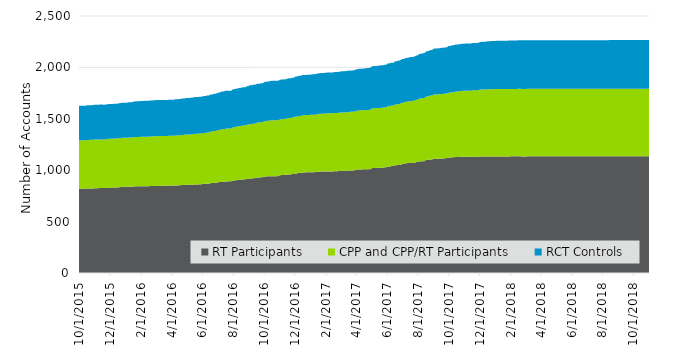
| Category | RT Participants | CPP and CPP/RT Participants | RCT Controls |
|---|---|---|---|
| 2015-10-01 | 819 | 470 | 337 |
| 2015-10-02 | 819 | 470 | 337 |
| 2015-10-03 | 820 | 470 | 337 |
| 2015-10-04 | 820 | 470 | 337 |
| 2015-10-05 | 819 | 470 | 337 |
| 2015-10-06 | 819 | 470 | 337 |
| 2015-10-07 | 820 | 470 | 337 |
| 2015-10-08 | 820 | 470 | 337 |
| 2015-10-09 | 821 | 470 | 337 |
| 2015-10-10 | 821 | 470 | 337 |
| 2015-10-11 | 821 | 470 | 337 |
| 2015-10-12 | 821 | 470 | 337 |
| 2015-10-13 | 821 | 470 | 337 |
| 2015-10-14 | 821 | 470 | 337 |
| 2015-10-15 | 822 | 470 | 337 |
| 2015-10-16 | 822 | 472 | 337 |
| 2015-10-17 | 822 | 472 | 337 |
| 2015-10-18 | 822 | 472 | 337 |
| 2015-10-19 | 822 | 472 | 337 |
| 2015-10-20 | 822 | 472 | 337 |
| 2015-10-21 | 823 | 472 | 337 |
| 2015-10-22 | 823 | 472 | 337 |
| 2015-10-23 | 823 | 472 | 337 |
| 2015-10-24 | 823 | 473 | 337 |
| 2015-10-25 | 823 | 473 | 337 |
| 2015-10-26 | 823 | 473 | 337 |
| 2015-10-27 | 823 | 473 | 338 |
| 2015-10-28 | 823 | 473 | 338 |
| 2015-10-29 | 823 | 473 | 338 |
| 2015-10-30 | 823 | 473 | 338 |
| 2015-10-31 | 825 | 473 | 338 |
| 2015-11-01 | 825 | 473 | 338 |
| 2015-11-02 | 825 | 473 | 338 |
| 2015-11-03 | 825 | 473 | 339 |
| 2015-11-04 | 825 | 473 | 339 |
| 2015-11-05 | 825 | 473 | 339 |
| 2015-11-06 | 825 | 473 | 339 |
| 2015-11-07 | 825 | 473 | 339 |
| 2015-11-08 | 825 | 473 | 339 |
| 2015-11-09 | 825 | 473 | 339 |
| 2015-11-10 | 826 | 473 | 339 |
| 2015-11-11 | 826 | 473 | 339 |
| 2015-11-12 | 826 | 473 | 339 |
| 2015-11-13 | 826 | 473 | 339 |
| 2015-11-14 | 826 | 473 | 339 |
| 2015-11-15 | 826 | 473 | 339 |
| 2015-11-16 | 826 | 473 | 339 |
| 2015-11-17 | 826 | 473 | 339 |
| 2015-11-18 | 826 | 473 | 338 |
| 2015-11-19 | 826 | 473 | 338 |
| 2015-11-20 | 826 | 473 | 338 |
| 2015-11-21 | 826 | 474 | 338 |
| 2015-11-22 | 826 | 474 | 338 |
| 2015-11-23 | 826 | 474 | 338 |
| 2015-11-24 | 826 | 474 | 338 |
| 2015-11-25 | 827 | 474 | 338 |
| 2015-11-26 | 829 | 474 | 338 |
| 2015-11-27 | 830 | 474 | 338 |
| 2015-11-28 | 830 | 475 | 338 |
| 2015-11-29 | 830 | 475 | 338 |
| 2015-11-30 | 830 | 475 | 338 |
| 2015-12-01 | 831 | 476 | 338 |
| 2015-12-02 | 831 | 476 | 338 |
| 2015-12-03 | 831 | 476 | 338 |
| 2015-12-04 | 831 | 476 | 338 |
| 2015-12-05 | 831 | 476 | 338 |
| 2015-12-06 | 831 | 476 | 338 |
| 2015-12-07 | 831 | 476 | 338 |
| 2015-12-08 | 832 | 476 | 339 |
| 2015-12-09 | 832 | 476 | 339 |
| 2015-12-10 | 832 | 476 | 339 |
| 2015-12-11 | 832 | 476 | 339 |
| 2015-12-12 | 832 | 476 | 339 |
| 2015-12-13 | 832 | 476 | 339 |
| 2015-12-14 | 832 | 476 | 339 |
| 2015-12-15 | 832 | 476 | 339 |
| 2015-12-16 | 833 | 476 | 339 |
| 2015-12-17 | 834 | 476 | 339 |
| 2015-12-18 | 835 | 476 | 339 |
| 2015-12-19 | 835 | 477 | 339 |
| 2015-12-20 | 835 | 477 | 339 |
| 2015-12-21 | 835 | 477 | 339 |
| 2015-12-22 | 836 | 477 | 340 |
| 2015-12-23 | 836 | 477 | 340 |
| 2015-12-24 | 837 | 477 | 341 |
| 2015-12-25 | 838 | 477 | 341 |
| 2015-12-26 | 838 | 477 | 341 |
| 2015-12-27 | 838 | 477 | 341 |
| 2015-12-28 | 838 | 477 | 341 |
| 2015-12-29 | 838 | 477 | 341 |
| 2015-12-30 | 838 | 477 | 341 |
| 2015-12-31 | 838 | 477 | 341 |
| 2016-01-01 | 838 | 477 | 341 |
| 2016-01-02 | 838 | 477 | 341 |
| 2016-01-03 | 838 | 477 | 341 |
| 2016-01-04 | 838 | 477 | 341 |
| 2016-01-05 | 839 | 477 | 343 |
| 2016-01-06 | 839 | 477 | 344 |
| 2016-01-07 | 839 | 477 | 344 |
| 2016-01-08 | 839 | 478 | 344 |
| 2016-01-09 | 839 | 479 | 344 |
| 2016-01-10 | 839 | 479 | 344 |
| 2016-01-11 | 839 | 479 | 344 |
| 2016-01-12 | 839 | 479 | 344 |
| 2016-01-13 | 839 | 479 | 344 |
| 2016-01-14 | 840 | 479 | 344 |
| 2016-01-15 | 840 | 480 | 344 |
| 2016-01-16 | 841 | 481 | 345 |
| 2016-01-17 | 841 | 481 | 345 |
| 2016-01-18 | 841 | 481 | 345 |
| 2016-01-19 | 842 | 481 | 346 |
| 2016-01-20 | 843 | 481 | 346 |
| 2016-01-21 | 843 | 481 | 347 |
| 2016-01-22 | 843 | 481 | 347 |
| 2016-01-23 | 843 | 481 | 347 |
| 2016-01-24 | 843 | 481 | 347 |
| 2016-01-25 | 843 | 481 | 347 |
| 2016-01-26 | 843 | 481 | 347 |
| 2016-01-27 | 843 | 481 | 347 |
| 2016-01-28 | 843 | 481 | 347 |
| 2016-01-29 | 843 | 481 | 347 |
| 2016-01-30 | 843 | 482 | 349 |
| 2016-01-31 | 843 | 482 | 349 |
| 2016-02-01 | 843 | 482 | 349 |
| 2016-02-02 | 843 | 482 | 349 |
| 2016-02-03 | 843 | 482 | 349 |
| 2016-02-04 | 843 | 482 | 349 |
| 2016-02-05 | 843 | 482 | 349 |
| 2016-02-06 | 844 | 482 | 349 |
| 2016-02-07 | 844 | 482 | 349 |
| 2016-02-08 | 844 | 482 | 349 |
| 2016-02-09 | 844 | 482 | 349 |
| 2016-02-10 | 844 | 482 | 349 |
| 2016-02-11 | 844 | 482 | 349 |
| 2016-02-12 | 844 | 482 | 350 |
| 2016-02-13 | 844 | 482 | 350 |
| 2016-02-14 | 844 | 482 | 350 |
| 2016-02-15 | 844 | 482 | 350 |
| 2016-02-16 | 844 | 482 | 350 |
| 2016-02-17 | 845 | 482 | 350 |
| 2016-02-18 | 846 | 482 | 350 |
| 2016-02-19 | 846 | 482 | 350 |
| 2016-02-20 | 846 | 482 | 350 |
| 2016-02-21 | 846 | 482 | 350 |
| 2016-02-22 | 846 | 482 | 350 |
| 2016-02-23 | 847 | 482 | 350 |
| 2016-02-24 | 847 | 483 | 350 |
| 2016-02-25 | 847 | 483 | 350 |
| 2016-02-26 | 847 | 483 | 351 |
| 2016-02-27 | 847 | 483 | 351 |
| 2016-02-28 | 847 | 483 | 351 |
| 2016-02-29 | 847 | 483 | 351 |
| 2016-03-01 | 847 | 484 | 351 |
| 2016-03-02 | 847 | 484 | 351 |
| 2016-03-03 | 847 | 484 | 351 |
| 2016-03-04 | 847 | 484 | 351 |
| 2016-03-05 | 848 | 484 | 351 |
| 2016-03-06 | 848 | 484 | 351 |
| 2016-03-07 | 848 | 484 | 351 |
| 2016-03-08 | 848 | 484 | 351 |
| 2016-03-09 | 848 | 484 | 351 |
| 2016-03-10 | 848 | 484 | 351 |
| 2016-03-11 | 848 | 484 | 351 |
| 2016-03-12 | 848 | 484 | 351 |
| 2016-03-13 | 848 | 484 | 351 |
| 2016-03-14 | 848 | 484 | 351 |
| 2016-03-15 | 848 | 484 | 351 |
| 2016-03-16 | 848 | 484 | 351 |
| 2016-03-17 | 848 | 484 | 351 |
| 2016-03-18 | 848 | 484 | 351 |
| 2016-03-19 | 848 | 484 | 351 |
| 2016-03-20 | 848 | 484 | 351 |
| 2016-03-21 | 848 | 484 | 351 |
| 2016-03-22 | 848 | 484 | 351 |
| 2016-03-23 | 848 | 484 | 351 |
| 2016-03-24 | 848 | 484 | 351 |
| 2016-03-25 | 850 | 484 | 351 |
| 2016-03-26 | 850 | 484 | 351 |
| 2016-03-27 | 850 | 484 | 351 |
| 2016-03-28 | 850 | 484 | 351 |
| 2016-03-29 | 850 | 484 | 351 |
| 2016-03-30 | 850 | 484 | 351 |
| 2016-03-31 | 850 | 484 | 351 |
| 2016-04-01 | 851 | 484 | 351 |
| 2016-04-02 | 851 | 484 | 351 |
| 2016-04-03 | 851 | 484 | 351 |
| 2016-04-04 | 851 | 484 | 351 |
| 2016-04-05 | 851 | 484 | 351 |
| 2016-04-06 | 852 | 484 | 351 |
| 2016-04-07 | 852 | 484 | 351 |
| 2016-04-08 | 852 | 485 | 352 |
| 2016-04-09 | 852 | 485 | 352 |
| 2016-04-10 | 852 | 485 | 352 |
| 2016-04-11 | 852 | 485 | 352 |
| 2016-04-12 | 852 | 485 | 352 |
| 2016-04-13 | 852 | 485 | 352 |
| 2016-04-14 | 853 | 486 | 352 |
| 2016-04-15 | 853 | 486 | 352 |
| 2016-04-16 | 854 | 487 | 352 |
| 2016-04-17 | 854 | 487 | 352 |
| 2016-04-18 | 854 | 487 | 352 |
| 2016-04-19 | 854 | 487 | 353 |
| 2016-04-20 | 854 | 487 | 353 |
| 2016-04-21 | 856 | 487 | 353 |
| 2016-04-22 | 856 | 487 | 354 |
| 2016-04-23 | 856 | 487 | 354 |
| 2016-04-24 | 856 | 487 | 354 |
| 2016-04-25 | 856 | 487 | 354 |
| 2016-04-26 | 857 | 487 | 354 |
| 2016-04-27 | 857 | 487 | 354 |
| 2016-04-28 | 858 | 487 | 354 |
| 2016-04-29 | 858 | 488 | 354 |
| 2016-04-30 | 858 | 489 | 355 |
| 2016-05-01 | 858 | 489 | 355 |
| 2016-05-02 | 858 | 489 | 355 |
| 2016-05-03 | 858 | 489 | 355 |
| 2016-05-04 | 858 | 489 | 355 |
| 2016-05-05 | 858 | 489 | 355 |
| 2016-05-06 | 859 | 489 | 355 |
| 2016-05-07 | 859 | 489 | 356 |
| 2016-05-08 | 859 | 489 | 356 |
| 2016-05-09 | 859 | 489 | 356 |
| 2016-05-10 | 859 | 490 | 356 |
| 2016-05-11 | 859 | 490 | 356 |
| 2016-05-12 | 859 | 490 | 356 |
| 2016-05-13 | 860 | 491 | 356 |
| 2016-05-14 | 862 | 491 | 356 |
| 2016-05-15 | 862 | 491 | 356 |
| 2016-05-16 | 862 | 491 | 356 |
| 2016-05-17 | 862 | 493 | 357 |
| 2016-05-18 | 862 | 493 | 357 |
| 2016-05-19 | 862 | 493 | 357 |
| 2016-05-20 | 862 | 493 | 358 |
| 2016-05-21 | 862 | 493 | 358 |
| 2016-05-22 | 862 | 493 | 358 |
| 2016-05-23 | 862 | 493 | 358 |
| 2016-05-24 | 862 | 493 | 358 |
| 2016-05-25 | 862 | 493 | 358 |
| 2016-05-26 | 863 | 493 | 358 |
| 2016-05-27 | 863 | 493 | 358 |
| 2016-05-28 | 864 | 493 | 358 |
| 2016-05-29 | 864 | 493 | 358 |
| 2016-05-30 | 864 | 493 | 358 |
| 2016-05-31 | 864 | 493 | 358 |
| 2016-06-01 | 866 | 493 | 358 |
| 2016-06-02 | 866 | 495 | 359 |
| 2016-06-03 | 866 | 495 | 359 |
| 2016-06-04 | 867 | 495 | 359 |
| 2016-06-05 | 867 | 495 | 359 |
| 2016-06-06 | 867 | 495 | 359 |
| 2016-06-07 | 867 | 496 | 359 |
| 2016-06-08 | 867 | 497 | 359 |
| 2016-06-09 | 868 | 497 | 360 |
| 2016-06-10 | 868 | 498 | 360 |
| 2016-06-11 | 868 | 499 | 360 |
| 2016-06-12 | 868 | 499 | 360 |
| 2016-06-13 | 868 | 499 | 360 |
| 2016-06-14 | 869 | 499 | 360 |
| 2016-06-15 | 870 | 500 | 360 |
| 2016-06-16 | 873 | 501 | 360 |
| 2016-06-17 | 874 | 501 | 360 |
| 2016-06-18 | 875 | 501 | 360 |
| 2016-06-19 | 875 | 501 | 360 |
| 2016-06-20 | 875 | 501 | 360 |
| 2016-06-21 | 876 | 502 | 360 |
| 2016-06-22 | 877 | 503 | 360 |
| 2016-06-23 | 877 | 504 | 360 |
| 2016-06-24 | 877 | 504 | 362 |
| 2016-06-25 | 878 | 504 | 362 |
| 2016-06-26 | 878 | 504 | 362 |
| 2016-06-27 | 878 | 504 | 362 |
| 2016-06-28 | 879 | 504 | 362 |
| 2016-06-29 | 879 | 504 | 363 |
| 2016-06-30 | 881 | 505 | 363 |
| 2016-07-01 | 883 | 507 | 364 |
| 2016-07-02 | 883 | 507 | 364 |
| 2016-07-03 | 883 | 507 | 364 |
| 2016-07-04 | 883 | 507 | 364 |
| 2016-07-05 | 885 | 509 | 364 |
| 2016-07-06 | 885 | 510 | 364 |
| 2016-07-07 | 885 | 510 | 364 |
| 2016-07-08 | 886 | 511 | 366 |
| 2016-07-09 | 887 | 511 | 368 |
| 2016-07-10 | 887 | 511 | 368 |
| 2016-07-11 | 887 | 511 | 368 |
| 2016-07-12 | 887 | 511 | 368 |
| 2016-07-13 | 887 | 511 | 368 |
| 2016-07-14 | 887 | 512 | 368 |
| 2016-07-15 | 888 | 512 | 368 |
| 2016-07-16 | 890 | 514 | 368 |
| 2016-07-17 | 890 | 514 | 368 |
| 2016-07-18 | 890 | 514 | 368 |
| 2016-07-19 | 891 | 514 | 368 |
| 2016-07-20 | 891 | 514 | 368 |
| 2016-07-21 | 891 | 514 | 368 |
| 2016-07-22 | 891 | 514 | 368 |
| 2016-07-23 | 892 | 513 | 368 |
| 2016-07-24 | 892 | 513 | 368 |
| 2016-07-25 | 892 | 513 | 368 |
| 2016-07-26 | 892 | 513 | 368 |
| 2016-07-27 | 892 | 513 | 368 |
| 2016-07-28 | 893 | 513 | 368 |
| 2016-07-29 | 893 | 516 | 368 |
| 2016-07-30 | 897 | 518 | 369 |
| 2016-07-31 | 897 | 518 | 369 |
| 2016-08-01 | 898 | 519 | 369 |
| 2016-08-02 | 898 | 519 | 369 |
| 2016-08-03 | 901 | 519 | 369 |
| 2016-08-04 | 901 | 519 | 369 |
| 2016-08-05 | 903 | 519 | 370 |
| 2016-08-06 | 903 | 519 | 370 |
| 2016-08-07 | 903 | 519 | 370 |
| 2016-08-08 | 903 | 519 | 370 |
| 2016-08-09 | 905 | 519 | 370 |
| 2016-08-10 | 906 | 520 | 370 |
| 2016-08-11 | 906 | 522 | 370 |
| 2016-08-12 | 907 | 522 | 370 |
| 2016-08-13 | 907 | 522 | 370 |
| 2016-08-14 | 907 | 522 | 370 |
| 2016-08-15 | 907 | 522 | 370 |
| 2016-08-16 | 908 | 523 | 372 |
| 2016-08-17 | 908 | 523 | 372 |
| 2016-08-18 | 910 | 523 | 372 |
| 2016-08-19 | 910 | 524 | 372 |
| 2016-08-20 | 910 | 524 | 372 |
| 2016-08-21 | 910 | 524 | 372 |
| 2016-08-22 | 910 | 524 | 372 |
| 2016-08-23 | 912 | 524 | 372 |
| 2016-08-24 | 912 | 524 | 372 |
| 2016-08-25 | 912 | 524 | 372 |
| 2016-08-26 | 913 | 525 | 373 |
| 2016-08-27 | 916 | 526 | 374 |
| 2016-08-28 | 916 | 526 | 374 |
| 2016-08-29 | 916 | 526 | 374 |
| 2016-08-30 | 916 | 526 | 374 |
| 2016-08-31 | 918 | 526 | 374 |
| 2016-09-01 | 918 | 529 | 375 |
| 2016-09-02 | 919 | 530 | 377 |
| 2016-09-03 | 920 | 530 | 377 |
| 2016-09-04 | 920 | 530 | 377 |
| 2016-09-05 | 920 | 530 | 377 |
| 2016-09-06 | 920 | 530 | 377 |
| 2016-09-07 | 920 | 530 | 378 |
| 2016-09-08 | 922 | 530 | 378 |
| 2016-09-09 | 922 | 530 | 379 |
| 2016-09-10 | 922 | 531 | 379 |
| 2016-09-11 | 922 | 531 | 379 |
| 2016-09-12 | 922 | 531 | 379 |
| 2016-09-13 | 923 | 532 | 379 |
| 2016-09-14 | 923 | 532 | 379 |
| 2016-09-15 | 924 | 532 | 379 |
| 2016-09-16 | 925 | 533 | 379 |
| 2016-09-17 | 929 | 534 | 379 |
| 2016-09-18 | 929 | 534 | 379 |
| 2016-09-19 | 929 | 534 | 379 |
| 2016-09-20 | 929 | 534 | 379 |
| 2016-09-21 | 929 | 534 | 379 |
| 2016-09-22 | 929 | 534 | 379 |
| 2016-09-23 | 929 | 534 | 379 |
| 2016-09-24 | 932 | 534 | 379 |
| 2016-09-25 | 932 | 534 | 379 |
| 2016-09-26 | 932 | 534 | 379 |
| 2016-09-27 | 932 | 534 | 379 |
| 2016-09-28 | 933 | 535 | 379 |
| 2016-09-29 | 933 | 535 | 379 |
| 2016-09-30 | 938 | 535 | 381 |
| 2016-10-01 | 939 | 538 | 381 |
| 2016-10-02 | 939 | 538 | 381 |
| 2016-10-03 | 939 | 538 | 381 |
| 2016-10-04 | 939 | 539 | 381 |
| 2016-10-05 | 939 | 540 | 381 |
| 2016-10-06 | 939 | 540 | 382 |
| 2016-10-07 | 940 | 540 | 383 |
| 2016-10-08 | 941 | 540 | 383 |
| 2016-10-09 | 941 | 540 | 383 |
| 2016-10-10 | 941 | 540 | 383 |
| 2016-10-11 | 941 | 540 | 383 |
| 2016-10-12 | 941 | 541 | 383 |
| 2016-10-13 | 941 | 542 | 384 |
| 2016-10-14 | 942 | 542 | 384 |
| 2016-10-15 | 942 | 543 | 384 |
| 2016-10-16 | 942 | 543 | 384 |
| 2016-10-17 | 942 | 543 | 384 |
| 2016-10-18 | 942 | 543 | 384 |
| 2016-10-19 | 942 | 543 | 384 |
| 2016-10-20 | 942 | 543 | 384 |
| 2016-10-21 | 942 | 543 | 384 |
| 2016-10-22 | 942 | 543 | 384 |
| 2016-10-23 | 942 | 543 | 384 |
| 2016-10-24 | 942 | 543 | 384 |
| 2016-10-25 | 942 | 543 | 384 |
| 2016-10-26 | 942 | 543 | 384 |
| 2016-10-27 | 942 | 543 | 384 |
| 2016-10-28 | 943 | 543 | 384 |
| 2016-10-29 | 945 | 544 | 384 |
| 2016-10-30 | 945 | 544 | 384 |
| 2016-10-31 | 945 | 544 | 384 |
| 2016-11-01 | 950 | 544 | 385 |
| 2016-11-02 | 952 | 544 | 385 |
| 2016-11-03 | 952 | 544 | 385 |
| 2016-11-04 | 953 | 544 | 385 |
| 2016-11-05 | 954 | 544 | 385 |
| 2016-11-06 | 954 | 544 | 385 |
| 2016-11-07 | 954 | 544 | 385 |
| 2016-11-08 | 954 | 544 | 385 |
| 2016-11-09 | 954 | 545 | 385 |
| 2016-11-10 | 954 | 545 | 385 |
| 2016-11-11 | 955 | 545 | 385 |
| 2016-11-12 | 955 | 545 | 385 |
| 2016-11-13 | 955 | 545 | 385 |
| 2016-11-14 | 955 | 545 | 385 |
| 2016-11-15 | 956 | 547 | 386 |
| 2016-11-16 | 957 | 548 | 386 |
| 2016-11-17 | 958 | 548 | 386 |
| 2016-11-18 | 959 | 549 | 386 |
| 2016-11-19 | 959 | 549 | 386 |
| 2016-11-20 | 959 | 549 | 386 |
| 2016-11-21 | 959 | 549 | 386 |
| 2016-11-22 | 959 | 549 | 386 |
| 2016-11-23 | 960 | 549 | 386 |
| 2016-11-24 | 960 | 550 | 386 |
| 2016-11-25 | 962 | 550 | 386 |
| 2016-11-26 | 962 | 551 | 386 |
| 2016-11-27 | 962 | 551 | 386 |
| 2016-11-28 | 962 | 551 | 386 |
| 2016-11-29 | 964 | 552 | 386 |
| 2016-11-30 | 965 | 552 | 386 |
| 2016-12-01 | 967 | 554 | 388 |
| 2016-12-02 | 969 | 554 | 388 |
| 2016-12-03 | 969 | 554 | 389 |
| 2016-12-04 | 969 | 554 | 389 |
| 2016-12-05 | 969 | 554 | 389 |
| 2016-12-06 | 970 | 554 | 389 |
| 2016-12-07 | 972 | 554 | 390 |
| 2016-12-08 | 972 | 554 | 390 |
| 2016-12-09 | 974 | 554 | 390 |
| 2016-12-10 | 974 | 554 | 391 |
| 2016-12-11 | 974 | 554 | 391 |
| 2016-12-12 | 974 | 554 | 391 |
| 2016-12-13 | 975 | 555 | 391 |
| 2016-12-14 | 975 | 555 | 391 |
| 2016-12-15 | 976 | 556 | 391 |
| 2016-12-16 | 978 | 556 | 391 |
| 2016-12-17 | 978 | 556 | 391 |
| 2016-12-18 | 978 | 556 | 391 |
| 2016-12-19 | 978 | 556 | 391 |
| 2016-12-20 | 978 | 556 | 391 |
| 2016-12-21 | 979 | 556 | 391 |
| 2016-12-22 | 979 | 556 | 392 |
| 2016-12-23 | 981 | 556 | 392 |
| 2016-12-24 | 981 | 556 | 392 |
| 2016-12-25 | 981 | 556 | 392 |
| 2016-12-26 | 981 | 556 | 392 |
| 2016-12-27 | 981 | 556 | 392 |
| 2016-12-28 | 981 | 556 | 392 |
| 2016-12-29 | 981 | 556 | 392 |
| 2016-12-30 | 981 | 556 | 392 |
| 2016-12-31 | 981 | 558 | 392 |
| 2017-01-01 | 981 | 558 | 392 |
| 2017-01-02 | 981 | 558 | 392 |
| 2017-01-03 | 981 | 558 | 392 |
| 2017-01-04 | 981 | 558 | 394 |
| 2017-01-05 | 981 | 558 | 394 |
| 2017-01-06 | 981 | 558 | 394 |
| 2017-01-07 | 981 | 558 | 394 |
| 2017-01-08 | 981 | 558 | 394 |
| 2017-01-09 | 981 | 558 | 394 |
| 2017-01-10 | 982 | 558 | 394 |
| 2017-01-11 | 983 | 559 | 394 |
| 2017-01-12 | 983 | 559 | 394 |
| 2017-01-13 | 984 | 559 | 395 |
| 2017-01-14 | 985 | 561 | 395 |
| 2017-01-15 | 985 | 561 | 395 |
| 2017-01-16 | 985 | 561 | 395 |
| 2017-01-17 | 986 | 562 | 395 |
| 2017-01-18 | 986 | 562 | 395 |
| 2017-01-19 | 986 | 562 | 395 |
| 2017-01-20 | 986 | 562 | 395 |
| 2017-01-21 | 987 | 563 | 395 |
| 2017-01-22 | 987 | 563 | 395 |
| 2017-01-23 | 987 | 563 | 395 |
| 2017-01-24 | 987 | 563 | 395 |
| 2017-01-25 | 987 | 563 | 395 |
| 2017-01-26 | 987 | 563 | 395 |
| 2017-01-27 | 987 | 563 | 395 |
| 2017-01-28 | 987 | 564 | 396 |
| 2017-01-29 | 987 | 564 | 396 |
| 2017-01-30 | 987 | 564 | 396 |
| 2017-01-31 | 987 | 564 | 396 |
| 2017-02-01 | 987 | 565 | 396 |
| 2017-02-02 | 988 | 565 | 396 |
| 2017-02-03 | 988 | 566 | 396 |
| 2017-02-04 | 988 | 567 | 396 |
| 2017-02-05 | 988 | 567 | 396 |
| 2017-02-06 | 988 | 567 | 396 |
| 2017-02-07 | 988 | 567 | 396 |
| 2017-02-08 | 988 | 567 | 396 |
| 2017-02-09 | 988 | 567 | 396 |
| 2017-02-10 | 988 | 567 | 396 |
| 2017-02-11 | 988 | 567 | 396 |
| 2017-02-12 | 988 | 567 | 396 |
| 2017-02-13 | 988 | 567 | 396 |
| 2017-02-14 | 988 | 567 | 396 |
| 2017-02-15 | 989 | 567 | 396 |
| 2017-02-16 | 989 | 567 | 396 |
| 2017-02-17 | 990 | 567 | 397 |
| 2017-02-18 | 990 | 567 | 398 |
| 2017-02-19 | 990 | 567 | 398 |
| 2017-02-20 | 990 | 567 | 398 |
| 2017-02-21 | 990 | 567 | 398 |
| 2017-02-22 | 990 | 567 | 398 |
| 2017-02-23 | 990 | 567 | 398 |
| 2017-02-24 | 991 | 567 | 398 |
| 2017-02-25 | 992 | 567 | 398 |
| 2017-02-26 | 992 | 567 | 398 |
| 2017-02-27 | 992 | 567 | 398 |
| 2017-02-28 | 993 | 567 | 398 |
| 2017-03-01 | 994 | 567 | 400 |
| 2017-03-02 | 994 | 567 | 401 |
| 2017-03-03 | 994 | 567 | 402 |
| 2017-03-04 | 994 | 567 | 402 |
| 2017-03-05 | 994 | 567 | 402 |
| 2017-03-06 | 994 | 567 | 402 |
| 2017-03-07 | 994 | 567 | 402 |
| 2017-03-08 | 994 | 567 | 402 |
| 2017-03-09 | 994 | 567 | 402 |
| 2017-03-10 | 994 | 567 | 402 |
| 2017-03-11 | 994 | 568 | 402 |
| 2017-03-12 | 994 | 568 | 402 |
| 2017-03-13 | 994 | 568 | 402 |
| 2017-03-14 | 995 | 569 | 402 |
| 2017-03-15 | 995 | 571 | 402 |
| 2017-03-16 | 995 | 571 | 402 |
| 2017-03-17 | 995 | 571 | 402 |
| 2017-03-18 | 997 | 571 | 402 |
| 2017-03-19 | 997 | 571 | 402 |
| 2017-03-20 | 997 | 571 | 402 |
| 2017-03-21 | 998 | 571 | 402 |
| 2017-03-22 | 998 | 571 | 402 |
| 2017-03-23 | 998 | 571 | 402 |
| 2017-03-24 | 998 | 571 | 402 |
| 2017-03-25 | 998 | 571 | 402 |
| 2017-03-26 | 998 | 571 | 402 |
| 2017-03-27 | 998 | 571 | 402 |
| 2017-03-28 | 1000 | 572 | 402 |
| 2017-03-29 | 1000 | 572 | 402 |
| 2017-03-30 | 1000 | 572 | 403 |
| 2017-03-31 | 1002 | 572 | 404 |
| 2017-04-01 | 1006 | 572 | 404 |
| 2017-04-02 | 1006 | 572 | 404 |
| 2017-04-03 | 1006 | 572 | 404 |
| 2017-04-04 | 1006 | 572 | 405 |
| 2017-04-05 | 1006 | 572 | 405 |
| 2017-04-06 | 1007 | 572 | 406 |
| 2017-04-07 | 1008 | 573 | 406 |
| 2017-04-08 | 1008 | 574 | 406 |
| 2017-04-09 | 1008 | 574 | 406 |
| 2017-04-10 | 1008 | 574 | 406 |
| 2017-04-11 | 1008 | 574 | 406 |
| 2017-04-12 | 1008 | 574 | 406 |
| 2017-04-13 | 1008 | 574 | 406 |
| 2017-04-14 | 1009 | 574 | 407 |
| 2017-04-15 | 1009 | 574 | 407 |
| 2017-04-16 | 1009 | 574 | 407 |
| 2017-04-17 | 1009 | 574 | 407 |
| 2017-04-18 | 1009 | 574 | 407 |
| 2017-04-19 | 1009 | 575 | 407 |
| 2017-04-20 | 1010 | 575 | 407 |
| 2017-04-21 | 1010 | 575 | 407 |
| 2017-04-22 | 1010 | 575 | 408 |
| 2017-04-23 | 1010 | 575 | 408 |
| 2017-04-24 | 1010 | 575 | 408 |
| 2017-04-25 | 1010 | 575 | 409 |
| 2017-04-26 | 1010 | 575 | 409 |
| 2017-04-27 | 1010 | 576 | 409 |
| 2017-04-28 | 1010 | 578 | 409 |
| 2017-04-29 | 1013 | 579 | 409 |
| 2017-04-30 | 1013 | 579 | 409 |
| 2017-05-01 | 1013 | 579 | 409 |
| 2017-05-02 | 1021 | 579 | 411 |
| 2017-05-03 | 1021 | 579 | 411 |
| 2017-05-04 | 1021 | 579 | 411 |
| 2017-05-05 | 1022 | 579 | 411 |
| 2017-05-06 | 1022 | 580 | 411 |
| 2017-05-07 | 1022 | 580 | 411 |
| 2017-05-08 | 1022 | 580 | 411 |
| 2017-05-09 | 1022 | 580 | 411 |
| 2017-05-10 | 1022 | 580 | 411 |
| 2017-05-11 | 1022 | 580 | 411 |
| 2017-05-12 | 1022 | 581 | 411 |
| 2017-05-13 | 1023 | 581 | 411 |
| 2017-05-14 | 1023 | 581 | 411 |
| 2017-05-15 | 1023 | 581 | 411 |
| 2017-05-16 | 1024 | 581 | 412 |
| 2017-05-17 | 1025 | 581 | 412 |
| 2017-05-18 | 1025 | 581 | 412 |
| 2017-05-19 | 1025 | 581 | 413 |
| 2017-05-20 | 1025 | 582 | 413 |
| 2017-05-21 | 1025 | 582 | 413 |
| 2017-05-22 | 1025 | 582 | 413 |
| 2017-05-23 | 1025 | 582 | 413 |
| 2017-05-24 | 1025 | 583 | 413 |
| 2017-05-25 | 1026 | 583 | 413 |
| 2017-05-26 | 1027 | 584 | 414 |
| 2017-05-27 | 1028 | 584 | 414 |
| 2017-05-28 | 1028 | 584 | 414 |
| 2017-05-29 | 1028 | 584 | 414 |
| 2017-05-30 | 1028 | 584 | 414 |
| 2017-05-31 | 1029 | 584 | 414 |
| 2017-06-01 | 1034 | 586 | 416 |
| 2017-06-02 | 1036 | 587 | 416 |
| 2017-06-03 | 1036 | 587 | 416 |
| 2017-06-04 | 1036 | 587 | 416 |
| 2017-06-05 | 1036 | 587 | 416 |
| 2017-06-06 | 1036 | 589 | 416 |
| 2017-06-07 | 1036 | 589 | 416 |
| 2017-06-08 | 1037 | 589 | 416 |
| 2017-06-09 | 1039 | 589 | 416 |
| 2017-06-10 | 1040 | 589 | 416 |
| 2017-06-11 | 1040 | 589 | 416 |
| 2017-06-12 | 1040 | 589 | 416 |
| 2017-06-13 | 1040 | 589 | 416 |
| 2017-06-14 | 1040 | 589 | 417 |
| 2017-06-15 | 1041 | 589 | 418 |
| 2017-06-16 | 1047 | 592 | 419 |
| 2017-06-17 | 1047 | 592 | 420 |
| 2017-06-18 | 1047 | 592 | 420 |
| 2017-06-19 | 1047 | 592 | 420 |
| 2017-06-20 | 1048 | 592 | 420 |
| 2017-06-21 | 1049 | 592 | 420 |
| 2017-06-22 | 1050 | 592 | 421 |
| 2017-06-23 | 1050 | 593 | 421 |
| 2017-06-24 | 1051 | 593 | 422 |
| 2017-06-25 | 1051 | 593 | 422 |
| 2017-06-26 | 1051 | 593 | 422 |
| 2017-06-27 | 1052 | 596 | 422 |
| 2017-06-28 | 1053 | 596 | 422 |
| 2017-06-29 | 1053 | 596 | 423 |
| 2017-06-30 | 1057 | 597 | 423 |
| 2017-07-01 | 1060 | 597 | 424 |
| 2017-07-02 | 1060 | 597 | 424 |
| 2017-07-03 | 1060 | 597 | 424 |
| 2017-07-04 | 1060 | 597 | 424 |
| 2017-07-05 | 1063 | 598 | 424 |
| 2017-07-06 | 1065 | 598 | 424 |
| 2017-07-07 | 1066 | 598 | 425 |
| 2017-07-08 | 1068 | 598 | 426 |
| 2017-07-09 | 1068 | 598 | 426 |
| 2017-07-10 | 1068 | 598 | 426 |
| 2017-07-11 | 1069 | 598 | 426 |
| 2017-07-12 | 1069 | 598 | 426 |
| 2017-07-13 | 1070 | 598 | 426 |
| 2017-07-14 | 1071 | 599 | 426 |
| 2017-07-15 | 1071 | 600 | 428 |
| 2017-07-16 | 1071 | 600 | 428 |
| 2017-07-17 | 1071 | 600 | 428 |
| 2017-07-18 | 1071 | 602 | 428 |
| 2017-07-19 | 1071 | 603 | 428 |
| 2017-07-20 | 1071 | 603 | 428 |
| 2017-07-21 | 1071 | 603 | 428 |
| 2017-07-22 | 1072 | 603 | 428 |
| 2017-07-23 | 1072 | 603 | 428 |
| 2017-07-24 | 1072 | 603 | 428 |
| 2017-07-25 | 1073 | 604 | 428 |
| 2017-07-26 | 1073 | 604 | 429 |
| 2017-07-27 | 1076 | 604 | 430 |
| 2017-07-28 | 1077 | 604 | 430 |
| 2017-07-29 | 1079 | 607 | 430 |
| 2017-07-30 | 1079 | 607 | 430 |
| 2017-07-31 | 1079 | 607 | 430 |
| 2017-08-01 | 1081 | 609 | 430 |
| 2017-08-02 | 1084 | 609 | 433 |
| 2017-08-03 | 1084 | 609 | 433 |
| 2017-08-04 | 1085 | 612 | 434 |
| 2017-08-05 | 1086 | 612 | 434 |
| 2017-08-06 | 1086 | 612 | 434 |
| 2017-08-07 | 1086 | 612 | 434 |
| 2017-08-08 | 1086 | 612 | 434 |
| 2017-08-09 | 1088 | 614 | 434 |
| 2017-08-10 | 1088 | 614 | 434 |
| 2017-08-11 | 1088 | 615 | 434 |
| 2017-08-12 | 1088 | 615 | 436 |
| 2017-08-13 | 1088 | 615 | 436 |
| 2017-08-14 | 1088 | 615 | 436 |
| 2017-08-15 | 1092 | 616 | 436 |
| 2017-08-16 | 1096 | 616 | 437 |
| 2017-08-17 | 1100 | 617 | 437 |
| 2017-08-18 | 1100 | 617 | 438 |
| 2017-08-19 | 1101 | 617 | 440 |
| 2017-08-20 | 1101 | 617 | 440 |
| 2017-08-21 | 1101 | 617 | 440 |
| 2017-08-22 | 1101 | 619 | 440 |
| 2017-08-23 | 1102 | 619 | 440 |
| 2017-08-24 | 1102 | 620 | 441 |
| 2017-08-25 | 1104 | 622 | 441 |
| 2017-08-26 | 1105 | 622 | 442 |
| 2017-08-27 | 1105 | 622 | 442 |
| 2017-08-28 | 1105 | 622 | 442 |
| 2017-08-29 | 1105 | 623 | 443 |
| 2017-08-30 | 1106 | 623 | 443 |
| 2017-08-31 | 1108 | 623 | 444 |
| 2017-09-01 | 1112 | 624 | 446 |
| 2017-09-02 | 1112 | 624 | 447 |
| 2017-09-03 | 1112 | 624 | 447 |
| 2017-09-04 | 1112 | 624 | 447 |
| 2017-09-05 | 1112 | 624 | 447 |
| 2017-09-06 | 1112 | 624 | 447 |
| 2017-09-07 | 1112 | 624 | 447 |
| 2017-09-08 | 1112 | 624 | 447 |
| 2017-09-09 | 1112 | 627 | 447 |
| 2017-09-10 | 1112 | 627 | 447 |
| 2017-09-11 | 1112 | 627 | 447 |
| 2017-09-12 | 1112 | 627 | 447 |
| 2017-09-13 | 1112 | 627 | 447 |
| 2017-09-14 | 1112 | 627 | 447 |
| 2017-09-15 | 1113 | 628 | 447 |
| 2017-09-16 | 1113 | 629 | 448 |
| 2017-09-17 | 1113 | 629 | 448 |
| 2017-09-18 | 1113 | 629 | 448 |
| 2017-09-19 | 1113 | 629 | 448 |
| 2017-09-20 | 1113 | 629 | 448 |
| 2017-09-21 | 1114 | 629 | 448 |
| 2017-09-22 | 1115 | 629 | 448 |
| 2017-09-23 | 1116 | 629 | 449 |
| 2017-09-24 | 1116 | 629 | 449 |
| 2017-09-25 | 1116 | 629 | 449 |
| 2017-09-26 | 1118 | 629 | 450 |
| 2017-09-27 | 1118 | 629 | 450 |
| 2017-09-28 | 1118 | 629 | 450 |
| 2017-09-29 | 1120 | 629 | 453 |
| 2017-09-30 | 1122 | 631 | 454 |
| 2017-10-01 | 1122 | 631 | 454 |
| 2017-10-02 | 1122 | 631 | 454 |
| 2017-10-03 | 1123 | 631 | 454 |
| 2017-10-04 | 1123 | 631 | 454 |
| 2017-10-05 | 1123 | 632 | 455 |
| 2017-10-06 | 1123 | 633 | 455 |
| 2017-10-07 | 1126 | 633 | 456 |
| 2017-10-08 | 1126 | 633 | 456 |
| 2017-10-09 | 1126 | 633 | 456 |
| 2017-10-10 | 1126 | 633 | 456 |
| 2017-10-11 | 1126 | 634 | 456 |
| 2017-10-12 | 1127 | 634 | 456 |
| 2017-10-13 | 1127 | 634 | 456 |
| 2017-10-14 | 1129 | 637 | 456 |
| 2017-10-15 | 1129 | 637 | 456 |
| 2017-10-16 | 1129 | 637 | 456 |
| 2017-10-17 | 1129 | 637 | 456 |
| 2017-10-18 | 1129 | 637 | 456 |
| 2017-10-19 | 1129 | 637 | 456 |
| 2017-10-20 | 1129 | 637 | 457 |
| 2017-10-21 | 1129 | 640 | 457 |
| 2017-10-22 | 1129 | 640 | 457 |
| 2017-10-23 | 1129 | 640 | 457 |
| 2017-10-24 | 1130 | 640 | 457 |
| 2017-10-25 | 1130 | 640 | 457 |
| 2017-10-26 | 1130 | 641 | 457 |
| 2017-10-27 | 1131 | 641 | 458 |
| 2017-10-28 | 1131 | 641 | 458 |
| 2017-10-29 | 1131 | 641 | 458 |
| 2017-10-30 | 1131 | 641 | 458 |
| 2017-10-31 | 1131 | 642 | 458 |
| 2017-11-01 | 1131 | 642 | 458 |
| 2017-11-02 | 1131 | 642 | 458 |
| 2017-11-03 | 1131 | 642 | 459 |
| 2017-11-04 | 1131 | 643 | 459 |
| 2017-11-05 | 1131 | 643 | 459 |
| 2017-11-06 | 1131 | 643 | 459 |
| 2017-11-07 | 1131 | 643 | 459 |
| 2017-11-08 | 1131 | 643 | 459 |
| 2017-11-09 | 1131 | 643 | 459 |
| 2017-11-10 | 1131 | 643 | 459 |
| 2017-11-11 | 1131 | 643 | 459 |
| 2017-11-12 | 1131 | 643 | 459 |
| 2017-11-13 | 1131 | 643 | 459 |
| 2017-11-14 | 1131 | 643 | 459 |
| 2017-11-15 | 1131 | 644 | 459 |
| 2017-11-16 | 1131 | 646 | 459 |
| 2017-11-17 | 1132 | 646 | 459 |
| 2017-11-18 | 1132 | 646 | 459 |
| 2017-11-19 | 1132 | 646 | 459 |
| 2017-11-20 | 1132 | 646 | 459 |
| 2017-11-21 | 1132 | 646 | 460 |
| 2017-11-22 | 1132 | 646 | 460 |
| 2017-11-23 | 1132 | 646 | 460 |
| 2017-11-24 | 1132 | 646 | 460 |
| 2017-11-25 | 1132 | 646 | 460 |
| 2017-11-26 | 1132 | 646 | 460 |
| 2017-11-27 | 1132 | 646 | 460 |
| 2017-11-28 | 1133 | 646 | 460 |
| 2017-11-29 | 1133 | 646 | 460 |
| 2017-11-30 | 1133 | 649 | 460 |
| 2017-12-01 | 1133 | 651 | 461 |
| 2017-12-02 | 1133 | 652 | 461 |
| 2017-12-03 | 1133 | 652 | 461 |
| 2017-12-04 | 1133 | 652 | 461 |
| 2017-12-05 | 1133 | 652 | 462 |
| 2017-12-06 | 1133 | 652 | 464 |
| 2017-12-07 | 1133 | 652 | 464 |
| 2017-12-08 | 1133 | 652 | 464 |
| 2017-12-09 | 1133 | 653 | 464 |
| 2017-12-10 | 1133 | 653 | 464 |
| 2017-12-11 | 1133 | 653 | 464 |
| 2017-12-12 | 1133 | 653 | 464 |
| 2017-12-13 | 1133 | 653 | 464 |
| 2017-12-14 | 1133 | 653 | 464 |
| 2017-12-15 | 1133 | 653 | 466 |
| 2017-12-16 | 1133 | 654 | 467 |
| 2017-12-17 | 1133 | 654 | 467 |
| 2017-12-18 | 1133 | 654 | 467 |
| 2017-12-19 | 1133 | 654 | 468 |
| 2017-12-20 | 1133 | 654 | 468 |
| 2017-12-21 | 1133 | 654 | 468 |
| 2017-12-22 | 1133 | 654 | 468 |
| 2017-12-23 | 1133 | 654 | 469 |
| 2017-12-24 | 1133 | 654 | 469 |
| 2017-12-25 | 1133 | 654 | 469 |
| 2017-12-26 | 1133 | 654 | 469 |
| 2017-12-27 | 1133 | 654 | 469 |
| 2017-12-28 | 1133 | 655 | 469 |
| 2017-12-29 | 1133 | 655 | 469 |
| 2017-12-30 | 1133 | 656 | 469 |
| 2017-12-31 | 1133 | 656 | 469 |
| 2018-01-01 | 1133 | 656 | 469 |
| 2018-01-02 | 1133 | 656 | 469 |
| 2018-01-03 | 1133 | 656 | 470 |
| 2018-01-04 | 1133 | 656 | 470 |
| 2018-01-05 | 1134 | 656 | 470 |
| 2018-01-06 | 1134 | 656 | 470 |
| 2018-01-07 | 1134 | 656 | 470 |
| 2018-01-08 | 1134 | 656 | 470 |
| 2018-01-09 | 1134 | 656 | 470 |
| 2018-01-10 | 1134 | 656 | 470 |
| 2018-01-11 | 1134 | 656 | 470 |
| 2018-01-12 | 1134 | 656 | 470 |
| 2018-01-13 | 1134 | 656 | 470 |
| 2018-01-14 | 1134 | 656 | 470 |
| 2018-01-15 | 1134 | 656 | 470 |
| 2018-01-16 | 1134 | 656 | 470 |
| 2018-01-17 | 1134 | 656 | 470 |
| 2018-01-18 | 1134 | 656 | 470 |
| 2018-01-19 | 1134 | 656 | 470 |
| 2018-01-20 | 1134 | 656 | 470 |
| 2018-01-21 | 1134 | 656 | 470 |
| 2018-01-22 | 1134 | 656 | 470 |
| 2018-01-23 | 1134 | 656 | 470 |
| 2018-01-24 | 1134 | 656 | 470 |
| 2018-01-25 | 1134 | 656 | 470 |
| 2018-01-26 | 1134 | 656 | 470 |
| 2018-01-27 | 1134 | 656 | 471 |
| 2018-01-28 | 1134 | 656 | 471 |
| 2018-01-29 | 1134 | 656 | 471 |
| 2018-01-30 | 1135 | 656 | 471 |
| 2018-01-31 | 1135 | 656 | 471 |
| 2018-02-01 | 1135 | 656 | 471 |
| 2018-02-02 | 1135 | 656 | 471 |
| 2018-02-03 | 1135 | 656 | 471 |
| 2018-02-04 | 1135 | 656 | 471 |
| 2018-02-05 | 1135 | 656 | 471 |
| 2018-02-06 | 1135 | 656 | 471 |
| 2018-02-07 | 1135 | 656 | 471 |
| 2018-02-08 | 1135 | 656 | 471 |
| 2018-02-09 | 1135 | 656 | 471 |
| 2018-02-10 | 1135 | 656 | 471 |
| 2018-02-11 | 1135 | 656 | 471 |
| 2018-02-12 | 1135 | 656 | 471 |
| 2018-02-13 | 1135 | 656 | 471 |
| 2018-02-14 | 1135 | 657 | 471 |
| 2018-02-15 | 1135 | 657 | 471 |
| 2018-02-16 | 1135 | 657 | 472 |
| 2018-02-17 | 1135 | 657 | 472 |
| 2018-02-18 | 1135 | 657 | 472 |
| 2018-02-19 | 1135 | 657 | 472 |
| 2018-02-20 | 1135 | 657 | 472 |
| 2018-02-21 | 1135 | 657 | 472 |
| 2018-02-22 | 1134 | 657 | 472 |
| 2018-02-23 | 1134 | 657 | 472 |
| 2018-02-24 | 1134 | 657 | 472 |
| 2018-02-25 | 1134 | 657 | 472 |
| 2018-02-26 | 1134 | 657 | 472 |
| 2018-02-27 | 1134 | 657 | 473 |
| 2018-02-28 | 1134 | 657 | 473 |
| 2018-03-01 | 1134 | 657 | 473 |
| 2018-03-02 | 1134 | 657 | 473 |
| 2018-03-03 | 1134 | 657 | 473 |
| 2018-03-04 | 1134 | 657 | 473 |
| 2018-03-05 | 1135 | 657 | 473 |
| 2018-03-06 | 1135 | 657 | 473 |
| 2018-03-07 | 1135 | 657 | 473 |
| 2018-03-08 | 1135 | 657 | 473 |
| 2018-03-09 | 1135 | 657 | 473 |
| 2018-03-10 | 1135 | 657 | 473 |
| 2018-03-11 | 1135 | 657 | 473 |
| 2018-03-12 | 1135 | 657 | 473 |
| 2018-03-13 | 1135 | 657 | 473 |
| 2018-03-14 | 1135 | 657 | 473 |
| 2018-03-15 | 1135 | 657 | 473 |
| 2018-03-16 | 1135 | 657 | 473 |
| 2018-03-17 | 1135 | 657 | 473 |
| 2018-03-18 | 1135 | 657 | 473 |
| 2018-03-19 | 1135 | 657 | 473 |
| 2018-03-20 | 1135 | 657 | 473 |
| 2018-03-21 | 1135 | 657 | 473 |
| 2018-03-22 | 1135 | 657 | 473 |
| 2018-03-23 | 1135 | 657 | 473 |
| 2018-03-24 | 1135 | 657 | 473 |
| 2018-03-25 | 1135 | 657 | 473 |
| 2018-03-26 | 1135 | 657 | 473 |
| 2018-03-27 | 1135 | 657 | 473 |
| 2018-03-28 | 1135 | 657 | 473 |
| 2018-03-29 | 1135 | 657 | 473 |
| 2018-03-30 | 1135 | 657 | 473 |
| 2018-03-31 | 1135 | 657 | 473 |
| 2018-04-01 | 1135 | 657 | 473 |
| 2018-04-02 | 1135 | 657 | 473 |
| 2018-04-03 | 1135 | 657 | 473 |
| 2018-04-04 | 1135 | 657 | 473 |
| 2018-04-05 | 1135 | 657 | 473 |
| 2018-04-06 | 1135 | 657 | 473 |
| 2018-04-07 | 1135 | 657 | 473 |
| 2018-04-08 | 1135 | 657 | 473 |
| 2018-04-09 | 1135 | 657 | 473 |
| 2018-04-10 | 1135 | 657 | 473 |
| 2018-04-11 | 1135 | 657 | 473 |
| 2018-04-12 | 1135 | 657 | 473 |
| 2018-04-13 | 1135 | 657 | 473 |
| 2018-04-14 | 1135 | 657 | 473 |
| 2018-04-15 | 1135 | 657 | 473 |
| 2018-04-16 | 1135 | 657 | 473 |
| 2018-04-17 | 1135 | 657 | 473 |
| 2018-04-18 | 1135 | 657 | 473 |
| 2018-04-19 | 1135 | 657 | 473 |
| 2018-04-20 | 1135 | 657 | 473 |
| 2018-04-21 | 1135 | 657 | 473 |
| 2018-04-22 | 1135 | 657 | 473 |
| 2018-04-23 | 1135 | 657 | 473 |
| 2018-04-24 | 1135 | 657 | 473 |
| 2018-04-25 | 1135 | 657 | 473 |
| 2018-04-26 | 1135 | 657 | 473 |
| 2018-04-27 | 1135 | 657 | 473 |
| 2018-04-28 | 1135 | 657 | 473 |
| 2018-04-29 | 1135 | 657 | 473 |
| 2018-04-30 | 1135 | 657 | 473 |
| 2018-05-01 | 1135 | 657 | 473 |
| 2018-05-02 | 1135 | 657 | 473 |
| 2018-05-03 | 1135 | 657 | 473 |
| 2018-05-04 | 1135 | 657 | 473 |
| 2018-05-05 | 1135 | 657 | 473 |
| 2018-05-06 | 1135 | 657 | 473 |
| 2018-05-07 | 1135 | 657 | 473 |
| 2018-05-08 | 1135 | 657 | 473 |
| 2018-05-09 | 1135 | 657 | 473 |
| 2018-05-10 | 1135 | 657 | 473 |
| 2018-05-11 | 1135 | 657 | 473 |
| 2018-05-12 | 1135 | 657 | 473 |
| 2018-05-13 | 1135 | 657 | 473 |
| 2018-05-14 | 1135 | 657 | 473 |
| 2018-05-15 | 1135 | 657 | 473 |
| 2018-05-16 | 1135 | 657 | 473 |
| 2018-05-17 | 1135 | 657 | 473 |
| 2018-05-18 | 1135 | 657 | 473 |
| 2018-05-19 | 1135 | 657 | 473 |
| 2018-05-20 | 1135 | 657 | 473 |
| 2018-05-21 | 1135 | 657 | 473 |
| 2018-05-22 | 1135 | 657 | 473 |
| 2018-05-23 | 1135 | 657 | 473 |
| 2018-05-24 | 1135 | 657 | 473 |
| 2018-05-25 | 1135 | 657 | 473 |
| 2018-05-26 | 1135 | 657 | 473 |
| 2018-05-27 | 1135 | 657 | 473 |
| 2018-05-28 | 1135 | 657 | 473 |
| 2018-05-29 | 1135 | 657 | 473 |
| 2018-05-30 | 1135 | 657 | 473 |
| 2018-05-31 | 1135 | 657 | 473 |
| 2018-06-01 | 1135 | 657 | 473 |
| 2018-06-02 | 1135 | 657 | 473 |
| 2018-06-03 | 1135 | 657 | 473 |
| 2018-06-04 | 1135 | 657 | 473 |
| 2018-06-05 | 1135 | 657 | 473 |
| 2018-06-06 | 1135 | 657 | 473 |
| 2018-06-07 | 1135 | 657 | 473 |
| 2018-06-08 | 1135 | 657 | 473 |
| 2018-06-09 | 1135 | 657 | 473 |
| 2018-06-10 | 1135 | 657 | 473 |
| 2018-06-11 | 1135 | 657 | 473 |
| 2018-06-12 | 1135 | 657 | 473 |
| 2018-06-13 | 1135 | 657 | 473 |
| 2018-06-14 | 1135 | 657 | 473 |
| 2018-06-15 | 1135 | 657 | 473 |
| 2018-06-16 | 1135 | 657 | 473 |
| 2018-06-17 | 1135 | 657 | 473 |
| 2018-06-18 | 1135 | 657 | 473 |
| 2018-06-19 | 1135 | 657 | 473 |
| 2018-06-20 | 1135 | 657 | 473 |
| 2018-06-21 | 1135 | 657 | 473 |
| 2018-06-22 | 1135 | 657 | 473 |
| 2018-06-23 | 1135 | 657 | 473 |
| 2018-06-24 | 1135 | 657 | 473 |
| 2018-06-25 | 1135 | 657 | 473 |
| 2018-06-26 | 1135 | 657 | 473 |
| 2018-06-27 | 1135 | 657 | 473 |
| 2018-06-28 | 1135 | 657 | 473 |
| 2018-06-29 | 1135 | 657 | 473 |
| 2018-06-30 | 1135 | 657 | 473 |
| 2018-07-01 | 1135 | 657 | 473 |
| 2018-07-02 | 1135 | 657 | 473 |
| 2018-07-03 | 1135 | 657 | 473 |
| 2018-07-04 | 1135 | 657 | 473 |
| 2018-07-05 | 1135 | 657 | 473 |
| 2018-07-06 | 1135 | 657 | 473 |
| 2018-07-07 | 1135 | 657 | 473 |
| 2018-07-08 | 1135 | 657 | 473 |
| 2018-07-09 | 1135 | 657 | 473 |
| 2018-07-10 | 1135 | 657 | 473 |
| 2018-07-11 | 1135 | 657 | 473 |
| 2018-07-12 | 1135 | 657 | 473 |
| 2018-07-13 | 1135 | 657 | 473 |
| 2018-07-14 | 1135 | 657 | 473 |
| 2018-07-15 | 1135 | 657 | 473 |
| 2018-07-16 | 1135 | 657 | 473 |
| 2018-07-17 | 1135 | 657 | 473 |
| 2018-07-18 | 1135 | 657 | 473 |
| 2018-07-19 | 1135 | 657 | 473 |
| 2018-07-20 | 1135 | 657 | 473 |
| 2018-07-21 | 1135 | 657 | 473 |
| 2018-07-22 | 1135 | 657 | 473 |
| 2018-07-23 | 1135 | 657 | 473 |
| 2018-07-24 | 1135 | 657 | 473 |
| 2018-07-25 | 1135 | 657 | 473 |
| 2018-07-26 | 1135 | 657 | 473 |
| 2018-07-27 | 1135 | 657 | 473 |
| 2018-07-28 | 1135 | 657 | 473 |
| 2018-07-29 | 1135 | 657 | 473 |
| 2018-07-30 | 1135 | 657 | 473 |
| 2018-07-31 | 1135 | 657 | 473 |
| 2018-08-01 | 1135 | 657 | 473 |
| 2018-08-02 | 1135 | 657 | 473 |
| 2018-08-03 | 1135 | 657 | 472 |
| 2018-08-04 | 1135 | 657 | 472 |
| 2018-08-05 | 1135 | 657 | 472 |
| 2018-08-06 | 1135 | 657 | 472 |
| 2018-08-07 | 1135 | 657 | 472 |
| 2018-08-08 | 1135 | 657 | 472 |
| 2018-08-09 | 1135 | 657 | 472 |
| 2018-08-10 | 1135 | 657 | 472 |
| 2018-08-11 | 1135 | 657 | 472 |
| 2018-08-12 | 1135 | 657 | 472 |
| 2018-08-13 | 1135 | 657 | 472 |
| 2018-08-14 | 1135 | 658 | 473 |
| 2018-08-15 | 1135 | 658 | 473 |
| 2018-08-16 | 1135 | 658 | 473 |
| 2018-08-17 | 1135 | 658 | 473 |
| 2018-08-18 | 1135 | 658 | 473 |
| 2018-08-19 | 1135 | 658 | 473 |
| 2018-08-20 | 1135 | 658 | 473 |
| 2018-08-21 | 1135 | 658 | 473 |
| 2018-08-22 | 1135 | 658 | 473 |
| 2018-08-23 | 1135 | 658 | 473 |
| 2018-08-24 | 1135 | 658 | 473 |
| 2018-08-25 | 1135 | 658 | 473 |
| 2018-08-26 | 1135 | 658 | 473 |
| 2018-08-27 | 1135 | 658 | 473 |
| 2018-08-28 | 1135 | 658 | 473 |
| 2018-08-29 | 1135 | 658 | 473 |
| 2018-08-30 | 1135 | 658 | 473 |
| 2018-08-31 | 1135 | 658 | 473 |
| 2018-09-01 | 1135 | 658 | 473 |
| 2018-09-02 | 1135 | 658 | 473 |
| 2018-09-03 | 1135 | 658 | 473 |
| 2018-09-04 | 1135 | 658 | 473 |
| 2018-09-05 | 1135 | 658 | 473 |
| 2018-09-06 | 1135 | 658 | 473 |
| 2018-09-07 | 1135 | 658 | 473 |
| 2018-09-08 | 1135 | 658 | 473 |
| 2018-09-09 | 1135 | 658 | 473 |
| 2018-09-10 | 1135 | 658 | 473 |
| 2018-09-11 | 1135 | 658 | 473 |
| 2018-09-12 | 1135 | 658 | 473 |
| 2018-09-13 | 1135 | 658 | 473 |
| 2018-09-14 | 1135 | 658 | 473 |
| 2018-09-15 | 1135 | 658 | 473 |
| 2018-09-16 | 1135 | 658 | 473 |
| 2018-09-17 | 1135 | 658 | 473 |
| 2018-09-18 | 1135 | 658 | 473 |
| 2018-09-19 | 1135 | 658 | 473 |
| 2018-09-20 | 1135 | 658 | 473 |
| 2018-09-21 | 1135 | 658 | 473 |
| 2018-09-22 | 1135 | 658 | 473 |
| 2018-09-23 | 1135 | 658 | 473 |
| 2018-09-24 | 1135 | 658 | 473 |
| 2018-09-25 | 1135 | 658 | 473 |
| 2018-09-26 | 1135 | 658 | 473 |
| 2018-09-27 | 1135 | 658 | 473 |
| 2018-09-28 | 1135 | 658 | 473 |
| 2018-09-29 | 1135 | 658 | 473 |
| 2018-09-30 | 1135 | 658 | 473 |
| 2018-10-01 | 1135 | 658 | 473 |
| 2018-10-02 | 1135 | 658 | 473 |
| 2018-10-03 | 1135 | 658 | 473 |
| 2018-10-04 | 1135 | 658 | 473 |
| 2018-10-05 | 1135 | 658 | 473 |
| 2018-10-06 | 1135 | 658 | 473 |
| 2018-10-07 | 1135 | 658 | 473 |
| 2018-10-08 | 1135 | 658 | 473 |
| 2018-10-09 | 1135 | 658 | 473 |
| 2018-10-10 | 1135 | 658 | 473 |
| 2018-10-11 | 1135 | 658 | 473 |
| 2018-10-12 | 1135 | 658 | 473 |
| 2018-10-13 | 1135 | 658 | 473 |
| 2018-10-14 | 1135 | 658 | 473 |
| 2018-10-15 | 1135 | 658 | 473 |
| 2018-10-16 | 1135 | 658 | 473 |
| 2018-10-17 | 1135 | 658 | 473 |
| 2018-10-18 | 1135 | 658 | 473 |
| 2018-10-19 | 1135 | 658 | 473 |
| 2018-10-20 | 1135 | 658 | 473 |
| 2018-10-21 | 1135 | 658 | 473 |
| 2018-10-22 | 1135 | 658 | 473 |
| 2018-10-23 | 1135 | 658 | 473 |
| 2018-10-24 | 1135 | 658 | 473 |
| 2018-10-25 | 1135 | 658 | 473 |
| 2018-10-26 | 1135 | 658 | 473 |
| 2018-10-27 | 1135 | 658 | 473 |
| 2018-10-28 | 1135 | 658 | 473 |
| 2018-10-29 | 1135 | 658 | 473 |
| 2018-10-30 | 1135 | 658 | 473 |
| 2018-10-31 | 1135 | 658 | 473 |
| 2018-11-01 | 1135 | 658 | 473 |